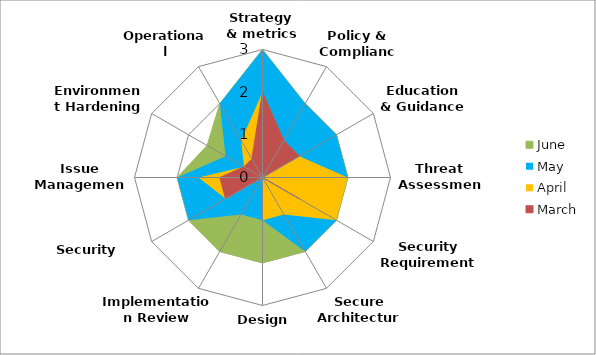
| Category | June | May | April | March |
|---|---|---|---|---|
| Strategy & metrics | 3 | 3 | 2 | 2 |
| Policy & Compliance | 2 | 2 | 1 | 1 |
| Education & Guidance | 2 | 2 | 1 | 1 |
| Threat Assessment | 2 | 2 | 2 | 0 |
| Security Requirements | 2 | 2 | 2 | 1 |
| Secure Architecture | 2 | 2 | 1 | 0 |
| Design Review | 2 | 1 | 1 | 0 |
| Implementation Review | 2 | 1 | 0 | 0 |
| Security Testing | 2 | 2 | 1 | 1 |
| Issue Management | 2 | 2 | 1.5 | 1 |
| Environment Hardening | 1.5 | 1 | 0.5 | 0.5 |
| Operational Enablement | 2 | 2 | 1 | 0.5 |